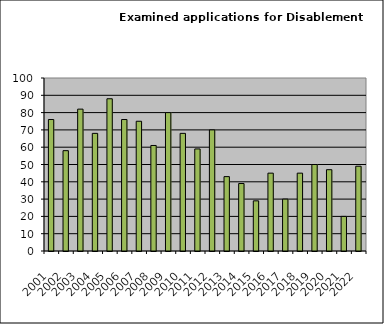
| Category | Series 0 |
|---|---|
| 2001.0 | 76 |
| 2002.0 | 58 |
| 2003.0 | 82 |
| 2004.0 | 68 |
| 2005.0 | 88 |
| 2006.0 | 76 |
| 2007.0 | 75 |
| 2008.0 | 61 |
| 2009.0 | 80 |
| 2010.0 | 68 |
| 2011.0 | 59 |
| 2012.0 | 70 |
| 2013.0 | 43 |
| 2014.0 | 39 |
| 2015.0 | 29 |
| 2016.0 | 45 |
| 2017.0 | 30 |
| 2018.0 | 45 |
| 2019.0 | 50 |
| 2020.0 | 47 |
| 2021.0 | 20 |
| 2022.0 | 49 |